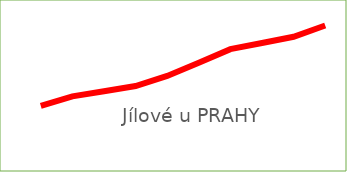
| Category | Jílové u Prahy |
|---|---|
| 2010 | 4239 |
| 2011 | 4312 |
| 2012 | 4352 |
| 2013 | 4392 |
| 2014 | 4469 |
| 2015 | 4571 |
| 2016 | 4675 |
| 2017 | 4722 |
| 2018 | 4770 |
| 2019 | 4857 |